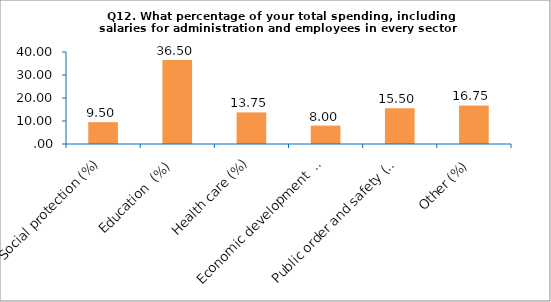
| Category | Series 0 |
|---|---|
| Social protection (%) | 9.5 |
| Education  (%) | 36.5 |
| Health care (%) | 13.75 |
| Economic development  (%) | 8 |
| Public order and safety (%) | 15.5 |
| Other (%) | 16.75 |